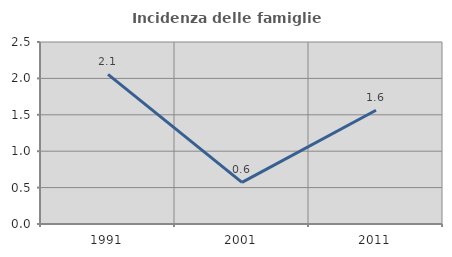
| Category | Incidenza delle famiglie numerose |
|---|---|
| 1991.0 | 2.055 |
| 2001.0 | 0.571 |
| 2011.0 | 1.562 |